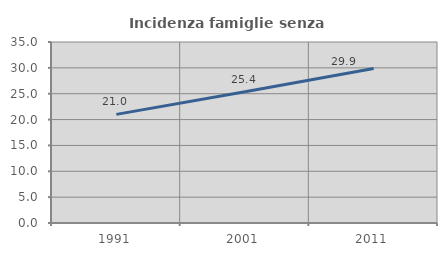
| Category | Incidenza famiglie senza nuclei |
|---|---|
| 1991.0 | 21.007 |
| 2001.0 | 25.364 |
| 2011.0 | 29.858 |